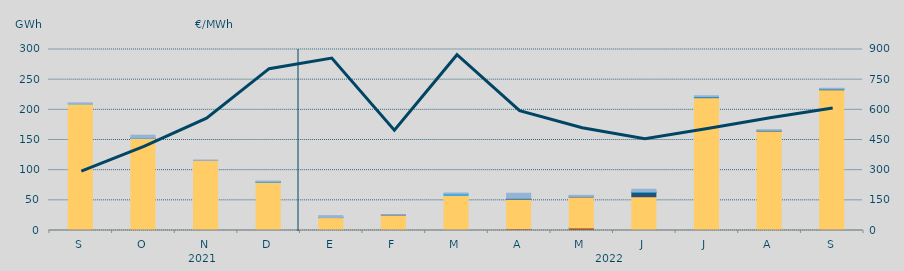
| Category | Carbón | Ciclo Combinado | Cogeneración | Consumo Bombeo | Enlace Península Baleares | Eólica | Hidráulica | Internacionales | Otras Renovables | Residuos no Renovables | Solar fotovoltaica | Solar térmica | Turbinación bombeo |
|---|---|---|---|---|---|---|---|---|---|---|---|---|---|
| S | 1190 | 208735.2 | 0 | 0 | 0 | 0 | 34.4 | 0 | 0 | 0 | 0 | 0 | 1592.2 |
| O | 1340 | 151473.6 | 0 | 156.2 | 0 | 0 | 130 | 0 | 0 | 0 | 0 | 0 | 4869.5 |
| N | 165 | 115928.8 | 0 | 16.1 | 30.6 | 0 | 0 | 0 | 0 | 0 | 0 | 0 | 373.4 |
| D | 0 | 79972.3 | 0 | 260.2 | 0 | 0 | 196.2 | 0 | 0 | 0 | 0 | 0 | 1577.4 |
| E | 0 | 21421.9 | 0 | 131 | 0 | 0 | 11.7 | 0 | 0 | 0 | 0 | 0 | 3055.8 |
| F | 0 | 25414.5 | 0 | 90.9 | 0 | 0 | 0 | 0 | 0 | 0 | 0 | 0 | 102.5 |
| M | 0 | 58378.9 | 0 | 0 | 204 | 0 | 2030 | 0 | 0 | 0 | 0 | 0 | 1537.1 |
| A | 2650 | 49297.5 | 0 | 1035.9 | 250 | 0 | 506.1 | 0 | 0 | 0 | 0 | 0 | 8012.5 |
| M | 4151 | 51455.8 | 0 | 906.775 | 0 | 0 | 22.4 | 0 | 0 | 0 | 0 | 0 | 1817.044 |
| J | 865 | 55112.458 | 0 | 7229.298 | 0 | 0.5 | 1411.333 | 0 | 0 | 0 | 0 | 0 | 3733.801 |
| J | 60 | 220106.232 | 0 | 916.465 | 0 | 0 | 693.475 | 0 | 0 | 0 | 0 | 0 | 1555.3 |
| A | 115 | 164760.775 | 0 | 1020.576 | 102 | 0 | 100 | 0 | 0 | 0 | 0 | 0 | 81.25 |
| S | 555 | 232710.6 | 0 | 982.5 | 388.7 | 0 | 418.25 | 0 | 0 | 0 | 0 | 0 | 708.4 |